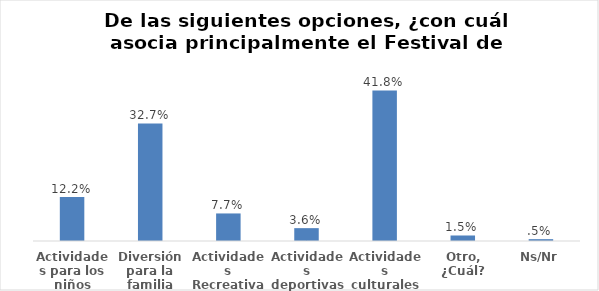
| Category | Series 0 |
|---|---|
| Actividades para los niños | 0.122 |
| Diversión para la familia | 0.327 |
| Actividades Recreativas | 0.077 |
| Actividades deportivas | 0.036 |
| Actividades culturales | 0.418 |
| Otro, ¿Cuál? | 0.015 |
| Ns/Nr | 0.005 |